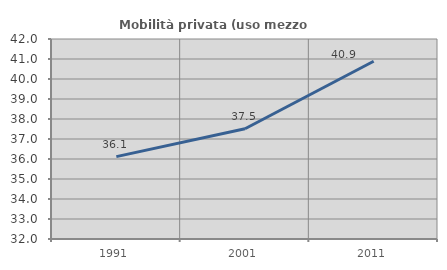
| Category | Mobilità privata (uso mezzo privato) |
|---|---|
| 1991.0 | 36.118 |
| 2001.0 | 37.513 |
| 2011.0 | 40.889 |